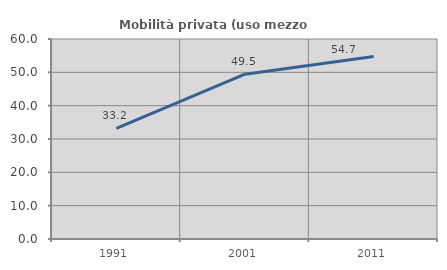
| Category | Mobilità privata (uso mezzo privato) |
|---|---|
| 1991.0 | 33.189 |
| 2001.0 | 49.458 |
| 2011.0 | 54.749 |